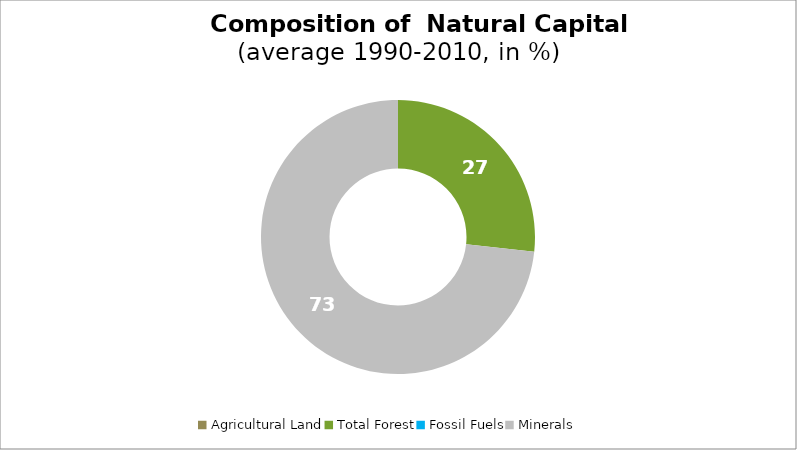
| Category | Series 0 |
|---|---|
| Agricultural Land | 0 |
| Total Forest | 26.707 |
| Fossil Fuels | 0 |
| Minerals | 73.293 |